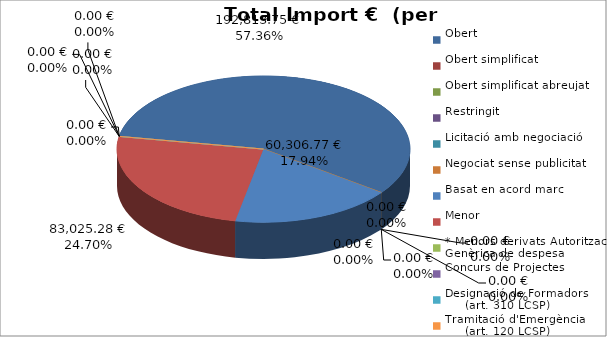
| Category | Total preu
(amb IVA) |
|---|---|
| Obert | 192813.75 |
| Obert simplificat | 0 |
| Obert simplificat abreujat | 0 |
| Restringit | 0 |
| Licitació amb negociació | 0 |
| Negociat sense publicitat | 0 |
| Basat en acord marc | 60306.77 |
| Menor | 83025.28 |
| * Menors derivats Autorització Genèrica de despesa | 0 |
| Concurs de Projectes | 0 |
| Designació de Formadors
     (art. 310 LCSP) | 0 |
| Tramitació d'Emergència
     (art. 120 LCSP) | 0 |